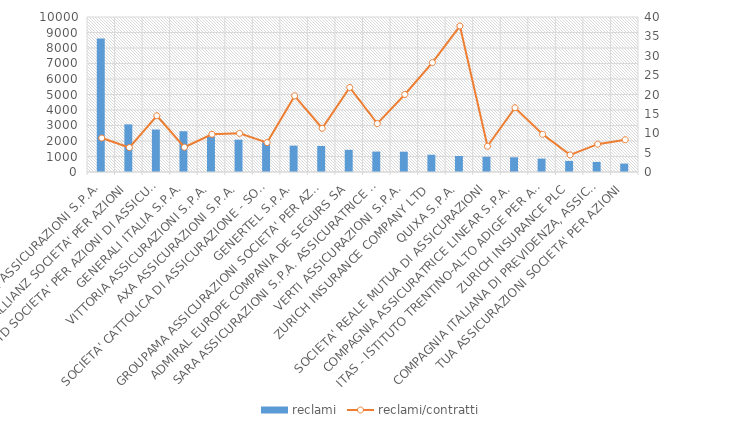
| Category | reclami |
|---|---|
| UNIPOLSAI ASSICURAZIONI S.P.A. | 8613 |
| ALLIANZ SOCIETA' PER AZIONI | 3074 |
| GENIALLOYD SOCIETA' PER AZIONI DI ASSICURAZIONI S.P.A. | 2740 |
| GENERALI ITALIA S.P.A. | 2630 |
| VITTORIA ASSICURAZIONI S.P.A. | 2281 |
| AXA ASSICURAZIONI S.P.A. | 2086 |
| SOCIETA' CATTOLICA DI ASSICURAZIONE - SOCIETA' COOPERATIVA | 1915 |
| GENERTEL S.P.A. | 1702 |
| GROUPAMA ASSICURAZIONI SOCIETA' PER AZIONI | 1680 |
| ADMIRAL EUROPE COMPANIA DE SEGURS SA | 1431 |
| SARA ASSICURAZIONI S.P.A. ASSICURATRICE UFFICIALE DELL'AUTOMOBILE CLUB D'ITALIA | 1316 |
| VERTI ASSICURAZIONI S.P.A. | 1309 |
| ZURICH INSURANCE COMPANY LTD | 1113 |
| QUIXA S.P.A. | 1031 |
| SOCIETA' REALE MUTUA DI ASSICURAZIONI | 986 |
| COMPAGNIA ASSICURATRICE LINEAR S.P.A. | 949 |
| ITAS - ISTITUTO TRENTINO-ALTO ADIGE PER ASSICURAZIONI S.M.A. | 863 |
| ZURICH INSURANCE PLC | 715 |
| COMPAGNIA ITALIANA DI PREVIDENZA, ASSICURAZIONI E RIASSICURAZIONI S.P.A. | 650 |
| TUA ASSICURAZIONI SOCIETA' PER AZIONI | 542 |